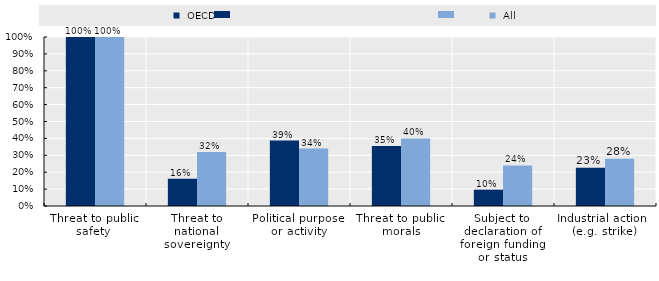
| Category |  OECD |  All |
|---|---|---|
| Threat to public safety  | 1 | 1 |
| Threat to national sovereignty | 0.161 | 0.32 |
| Political purpose or activity | 0.387 | 0.34 |
| Threat to public morals | 0.355 | 0.4 |
| Subject to declaration of foreign funding or status | 0.097 | 0.24 |
| Industrial action 
(e.g. strike) | 0.226 | 0.28 |